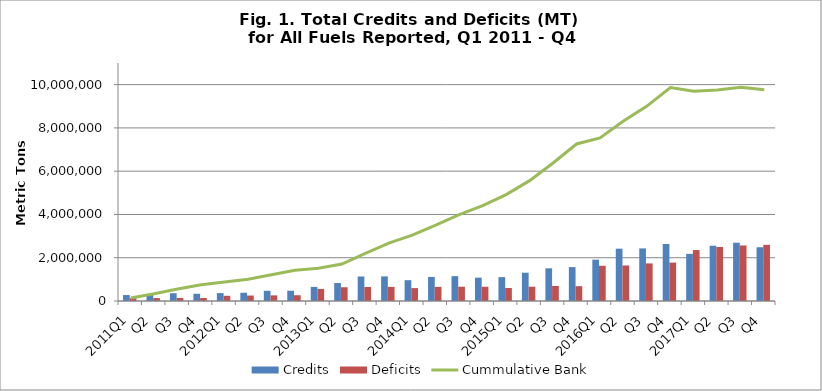
| Category | Credits | Deficits |
|---|---|---|
| 2011Q1 | 275639 | 132283 |
| Q2 | 325071 | 134760 |
| Q3 | 358817 | 141381 |
| Q4 | 334451 | 137396 |
| 2012Q1 | 366391 | 240260 |
| Q2 | 380783 | 252750 |
| Q3 | 471290 | 259582 |
| Q4 | 473045 | 266666 |
| 2013Q1 | 652535 | 558804 |
| Q2 | 832203 | 636140 |
| Q3 | 1132158 | 646613 |
| Q4 | 1137345 | 653565 |
| 2014Q1 | 961291 | 596240 |
| Q2 | 1111634 | 653122 |
| Q3 | 1148264 | 660254 |
| Q4 | 1079152 | 657732 |
| 2015Q1 | 1102964 | 599822 |
| Q2 | 1307728 | 660642 |
| Q3 | 1510993 | 696989 |
| Q4 | 1567164 | 686418 |
| 2016Q1 | 1909687 | 1627706 |
| Q2 | 2417766 | 1641877 |
| Q3 | 2430418 | 1736739 |
| Q4 | 2633877 | 1774142 |
| 2017Q1 | 2178481 | 2355125 |
| Q2 | 2554676 | 2497245 |
| Q3 | 2693885 | 2566313 |
| Q4 | 2485157 | 2595665 |